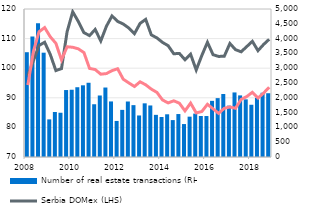
| Category | Number of real estate transactions (RHS) |
|---|---|
| 2008 | 3540 |
| II | 4071 |
| III | 4515 |
| IV | 3524 |
| 2009 | 1271 |
| II | 1521 |
| III | 1495 |
| IV | 2262 |
| 2010 | 2272 |
| II | 2357 |
| III | 2422 |
| IV | 2508 |
| 2011 | 1782 |
| II | 2078 |
| III | 2347 |
| IV | 1877 |
| 2012 | 1218 |
| II | 1592 |
| III | 1875 |
| IV | 1752 |
| 2013 | 1403 |
| II | 1813 |
| III | 1741 |
| IV | 1424 |
| 2014 | 1351 |
| II | 1443 |
| III | 1247 |
| IV | 1451 |
| 2015 | 1113 |
| II | 1363 |
| III | 1466 |
| IV | 1385 |
| 2016 | 1384 |
| II | 1897 |
| III | 1989 |
| IV | 2128 |
| 2017 | 1735 |
| II | 2181 |
| III | 2081 |
| IV | 1948 |
| 2018 | 1765 |
| II | 1999 |
| III | 2171 |
| IV | 2154 |